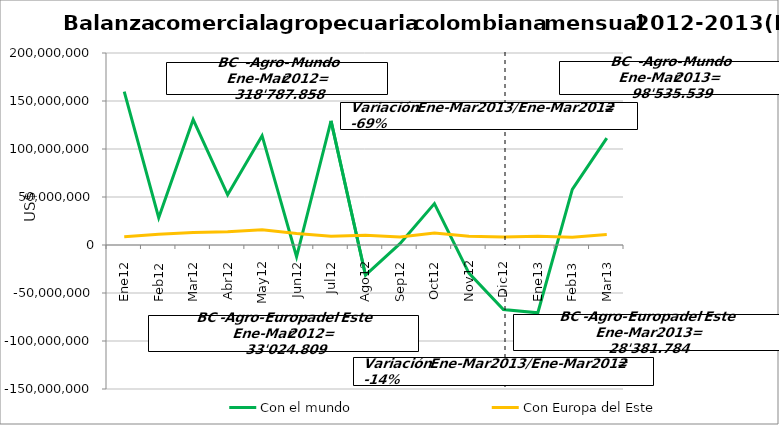
| Category | Con el mundo | Con Europa del Este |
|---|---|---|
| 0 | 159718841.64 | 8707350.43 |
| 1 | 28365041.12 | 11209409.27 |
| 2 | 130703974.8 | 13108049.26 |
| 3 | 52247918.23 | 13825394.53 |
| 4 | 113869717.7 | 15797976.27 |
| 5 | -12237480.38 | 11991224.68 |
| 6 | 129307528.98 | 9054947 |
| 7 | -31469442.96 | 10268705.67 |
| 8 | 1432914.69 | 8444044.03 |
| 9 | 43090007.69 | 12458054.35 |
| 10 | -29233824.97 | 9102658.74 |
| 11 | -67196777.37 | 8431570.65 |
| 12 | -70591672.64 | 9219069.08 |
| 13 | 57888002.76 | 8114940.65 |
| 14 | 111239208.87 | 11047774.71 |